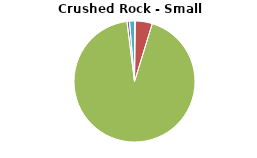
| Category | Series 0 |
|---|---|
| DRILLING AND BLASTING | 1.231 |
| MATERIAL PROCESSING | 27.05 |
| INTERNAL TRANSPORT | 555.999 |
| MATERIAL HANDLING OPERATION | 4.078 |
| WIND EROSION FROM STOCKPILES | 7.838 |